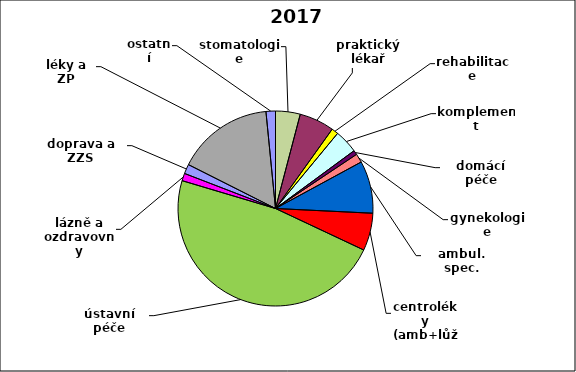
| Category | Series 0 |
|---|---|
| stomatologie | 0.041 |
| praktický lékař | 0.058 |
| rehabilitace | 0.011 |
| komplement | 0.039 |
| domácí péče | 0.007 |
| gynekologie | 0.015 |
| ambul. spec. | 0.087 |
| centroléky (amb+lůž) | 0.062 |
| ústavní péče | 0.476 |
| lázně a ozdravovny | 0.012 |
| doprava a ZZS | 0.016 |
| léky a ZP | 0.16 |
| ostatní | 0.016 |